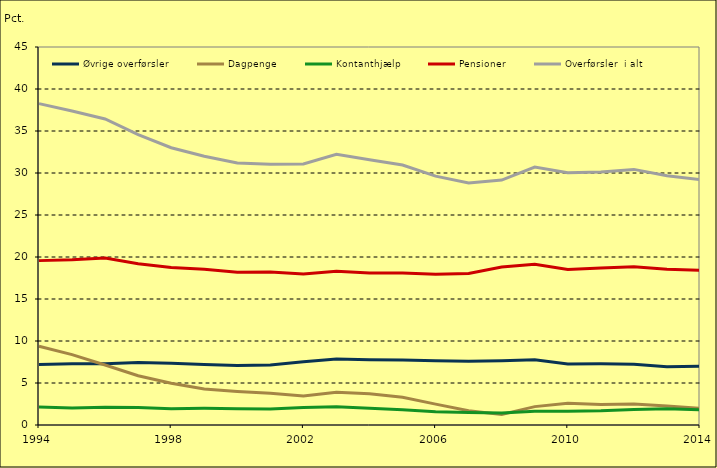
| Category | Øvrige overførsler | Dagpenge | Kontanthjælp | Pensioner | Overførsler  i alt |
|---|---|---|---|---|---|
| 1994.0 | 7.198 | 9.366 | 2.128 | 19.569 | 38.261 |
| 1995.0 | 7.291 | 8.383 | 2.029 | 19.681 | 37.384 |
| 1996.0 | 7.306 | 7.137 | 2.108 | 19.887 | 36.437 |
| 1997.0 | 7.438 | 5.871 | 2.069 | 19.193 | 34.571 |
| 1998.0 | 7.353 | 4.971 | 1.934 | 18.748 | 33.006 |
| 1999.0 | 7.207 | 4.276 | 1.98 | 18.527 | 31.991 |
| 2000.0 | 7.069 | 4.002 | 1.947 | 18.182 | 31.199 |
| 2001.0 | 7.155 | 3.779 | 1.893 | 18.206 | 31.032 |
| 2002.0 | 7.528 | 3.467 | 2.095 | 17.985 | 31.076 |
| 2003.0 | 7.854 | 3.889 | 2.172 | 18.305 | 32.22 |
| 2004.0 | 7.777 | 3.724 | 1.987 | 18.09 | 31.578 |
| 2005.0 | 7.745 | 3.292 | 1.82 | 18.086 | 30.943 |
| 2006.0 | 7.642 | 2.483 | 1.571 | 17.935 | 29.63 |
| 2007.0 | 7.596 | 1.698 | 1.492 | 18.036 | 28.822 |
| 2008.0 | 7.65 | 1.251 | 1.44 | 18.814 | 29.155 |
| 2009.0 | 7.765 | 2.189 | 1.624 | 19.129 | 30.707 |
| 2010.0 | 7.271 | 2.592 | 1.646 | 18.514 | 30.023 |
| 2011.0 | 7.282 | 2.445 | 1.696 | 18.688 | 30.111 |
| 2012.0 | 7.231 | 2.508 | 1.843 | 18.848 | 30.43 |
| 2013.0 | 6.936 | 2.273 | 1.924 | 18.544 | 29.678 |
| 2014.0 | 7 | 1.994 | 1.808 | 18.419 | 29.222 |